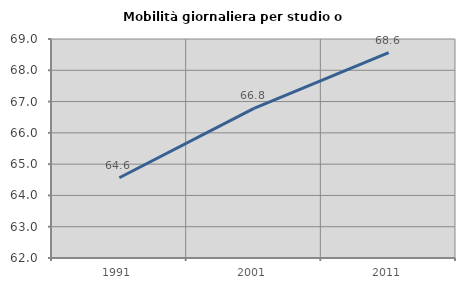
| Category | Mobilità giornaliera per studio o lavoro |
|---|---|
| 1991.0 | 64.565 |
| 2001.0 | 66.782 |
| 2011.0 | 68.564 |